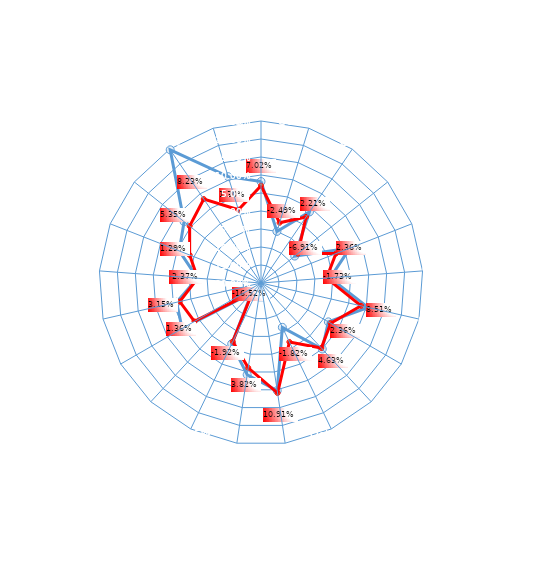
| Category | Series 0 | Series 1 |
|---|---|---|
| Oct-2021, 8.18% | 0.082 | 0.07 |
| Oct-2020, -5.00% | -0.05 | -0.025 |
| Oct-2019, 3.90% | 0.039 | 0.022 |
| Oct-2018, -8.00% | -0.08 | -0.069 |
| Oct-2017, 6.51% | 0.065 | 0.024 |
| Oct-2016, -.75% | -0.008 | -0.017 |
| Oct-2015, 10.51% | 0.105 | 0.085 |
| Oct-2014, 1.60% | 0.016 | 0.024 |
| Oct-2013, 5.02% | 0.05 | 0.046 |
| Oct-2012, -6.33% | -0.063 | -0.018 |
| Oct-2011, 10.21% | 0.102 | 0.109 |
| Oct-2010, 5.78% | 0.058 | 0.038 |
| Oct-2009, -1.25% | -0.012 | -0.019 |
| Oct-2008, -16.12% | -0.161 | -0.165 |
| Oct-2007, 5.30% | 0.053 | 0.014 |
| Oct-2006, 4.05% | 0.04 | 0.032 |
| Oct-2005, -2.30% | -0.023 | -0.024 |
| Oct-2004, 4.39% | 0.044 | 0.013 |
| Oct-2003, 7.33% | 0.073 | 0.054 |
| Oct-2002, 24.77% | 0.248 | 0.082 |
| Oct-2001, 10.91% | 0.109 | 0.013 |